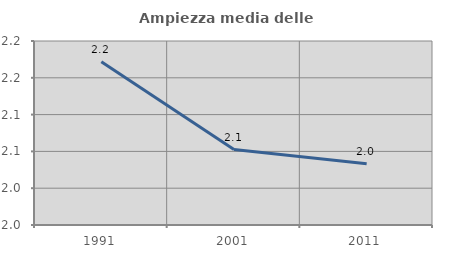
| Category | Ampiezza media delle famiglie |
|---|---|
| 1991.0 | 2.172 |
| 2001.0 | 2.052 |
| 2011.0 | 2.033 |